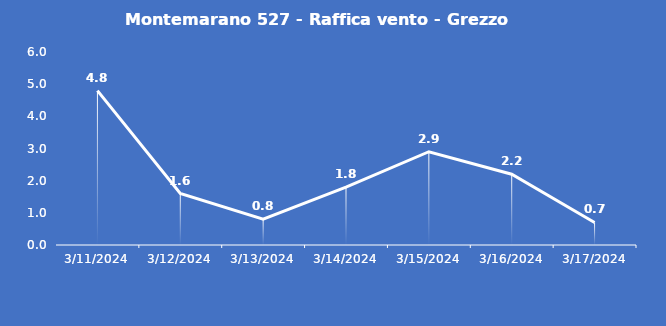
| Category | Montemarano 527 - Raffica vento - Grezzo (m/s) |
|---|---|
| 3/11/24 | 4.8 |
| 3/12/24 | 1.6 |
| 3/13/24 | 0.8 |
| 3/14/24 | 1.8 |
| 3/15/24 | 2.9 |
| 3/16/24 | 2.2 |
| 3/17/24 | 0.7 |